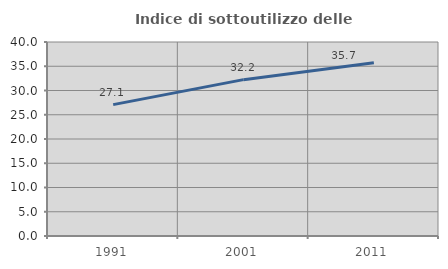
| Category | Indice di sottoutilizzo delle abitazioni  |
|---|---|
| 1991.0 | 27.087 |
| 2001.0 | 32.239 |
| 2011.0 | 35.737 |